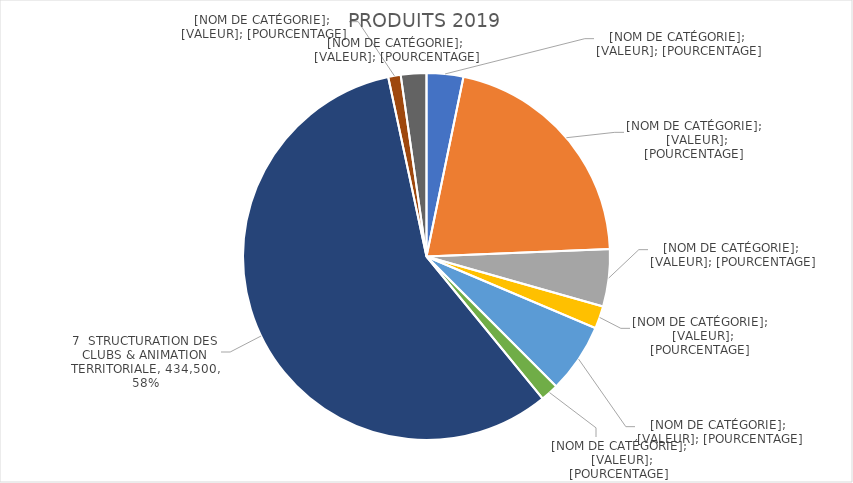
| Category | Series 0 |
|---|---|
| 1 ATHLETISME COMPETITION | 24400 |
| 2 SUIVI ATHLETES | 159456 |
| 3 ATHLETISME DES JEUNES | 38000 |
| 4 ATHLE RUNNING | 15000 |
| 5 ATHLE SANTE LOISIRS | 46300 |
| 6 FORMATIONS | 11900 |
| 7  STRUCTURATION DES CLUBS & ANIMATION TERRITORIALE | 434500 |
| 8 STRUCTURE REGIONALE | 8300 |
| 9 ADMINISTRATION | 16980 |